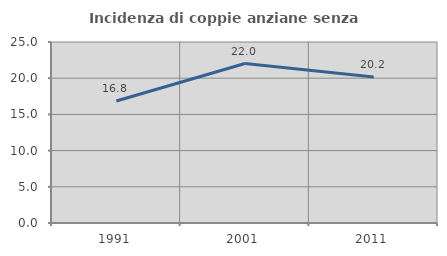
| Category | Incidenza di coppie anziane senza figli  |
|---|---|
| 1991.0 | 16.845 |
| 2001.0 | 22.03 |
| 2011.0 | 20.178 |